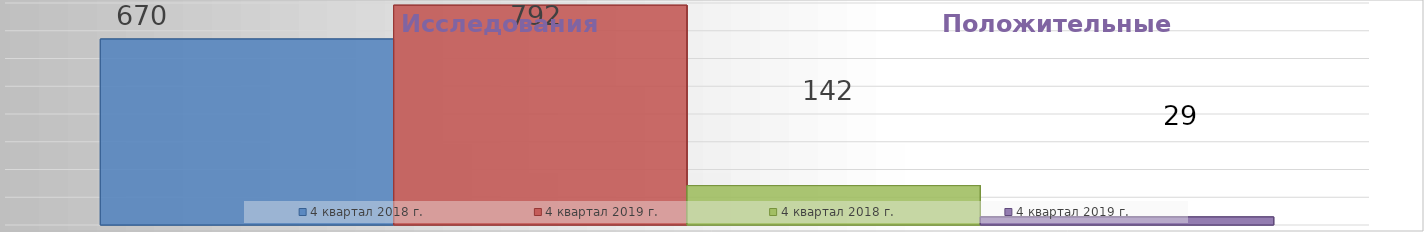
| Category | 4 квартал 2018 г. | 4 квартал 2019 г. |
|---|---|---|
| Проб/исследований | 142 | 29 |